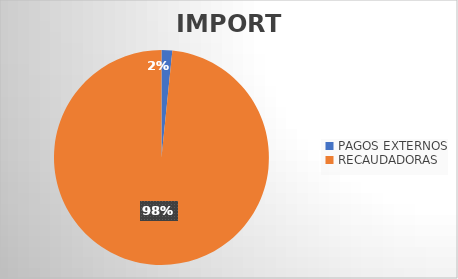
| Category | IMPORTE |
|---|---|
| PAGOS EXTERNOS | 3013449.81 |
| RECAUDADORAS | 183525316.03 |